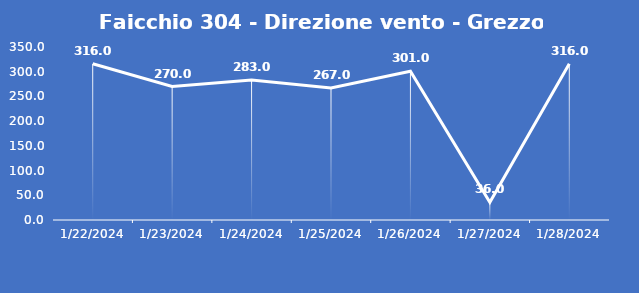
| Category | Faicchio 304 - Direzione vento - Grezzo (°N) |
|---|---|
| 1/22/24 | 316 |
| 1/23/24 | 270 |
| 1/24/24 | 283 |
| 1/25/24 | 267 |
| 1/26/24 | 301 |
| 1/27/24 | 36 |
| 1/28/24 | 316 |